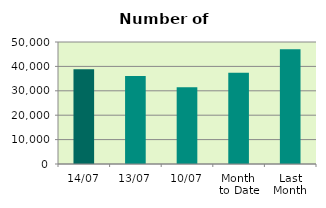
| Category | Series 0 |
|---|---|
| 14/07 | 38828 |
| 13/07 | 36030 |
| 10/07 | 31416 |
| Month 
to Date | 37440.4 |
| Last
Month | 46980.273 |